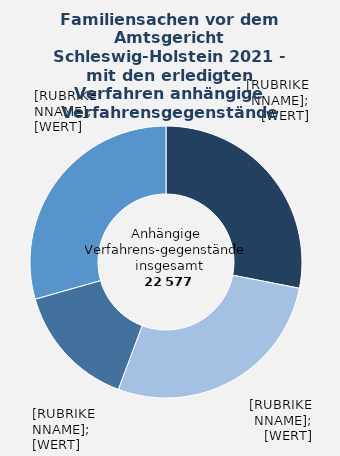
| Category | in Prozent |
|---|---|
| Versorgungsausgleich | 0.281 |
| Scheidung | 0.276 |
| elterliche Sorge | 0.149 |
| Übrige Verfahrensgegenstände¹  | 0.294 |